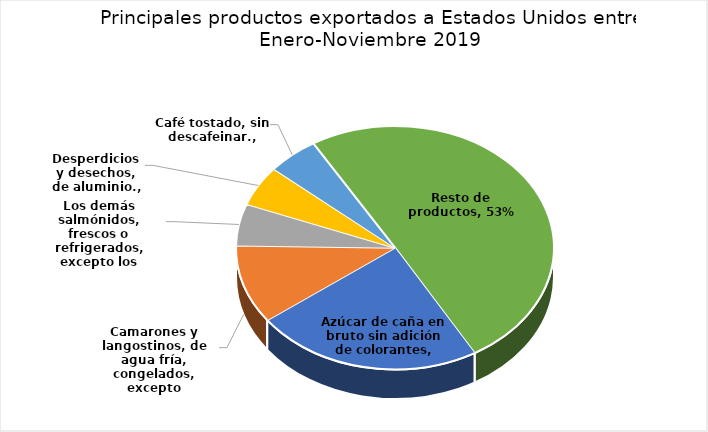
| Category | Series 0 |
|---|---|
| Azúcar de caña en bruto sin adición de colorantes | 0.244 |
| Camarones y langostinos, de agua fría, congelados, excepto ahumados. | 0.11 |
| Los demás salmónidos, frescos o refrigerados, excepto los hígados, huevas y lechas. | 0.059 |
| Desperdicios y desechos, de aluminio. | 0.057 |
| Café tostado, sin descafeinar. | 0.055 |
| Resto de productos | 0.53 |